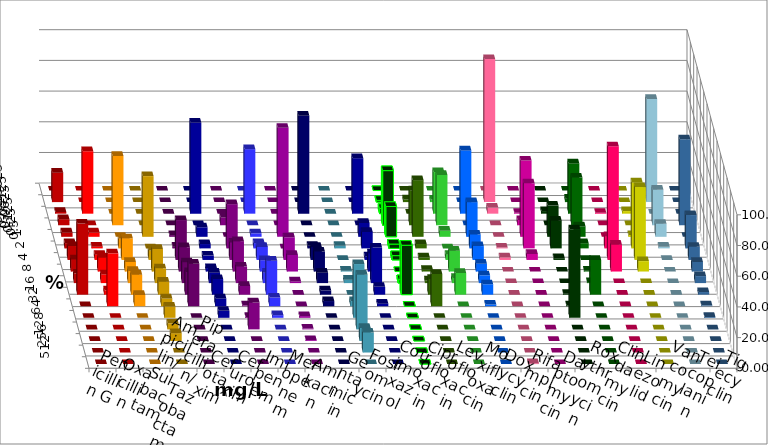
| Category | Penicillin G | Oxacillin | Ampicillin/ Sulbactam | Piperacillin/ Tazobactam | Cefotaxim | Cefuroxim | Imipenem | Meropenem | Amikacin | Gentamicin | Fosfomycin | Cotrimoxazol | Ciprofloxacin | Levofloxacin | Moxifloxacin | Doxycyclin | Rifampicin | Daptomycin | Roxythromycin | Clindamycin | Linezolid | Vancomycin | Teicoplanin | Tigecyclin |
|---|---|---|---|---|---|---|---|---|---|---|---|---|---|---|---|---|---|---|---|---|---|---|---|---|
| 0.015625 | 0 | 0 | 0 | 0 | 0 | 0 | 0 | 0 | 0 | 0 | 0 | 0 | 0 | 0 | 0 | 0 | 0 | 0 | 0 | 0 | 0 | 0 | 0 | 0 |
| 0.03125 | 19.209 | 0 | 0 | 0 | 0 | 0 | 0 | 0 | 0 | 0 | 0 | 0 | 1.13 | 1.705 | 1.695 | 0 | 93.22 | 0 | 0 | 2.26 | 0 | 0 | 0 | 67.232 |
| 0.0625 | 1.13 | 40.678 | 0 | 0 | 0 | 0 | 59.322 | 42.045 | 0 | 63.842 | 0 | 36.158 | 3.39 | 0 | 27.119 | 41.243 | 3.955 | 0.565 | 1.695 | 32.768 | 0.565 | 1.695 | 0 | 0 |
| 0.125 | 3.955 | 0 | 45.198 | 0 | 0 | 5.085 | 0 | 0 | 0 | 0 | 0 | 0 | 35.593 | 22.727 | 32.768 | 0 | 0 | 3.39 | 0 | 31.073 | 0 | 0 | 56 | 23.164 |
| 0.25 | 2.825 | 2.825 | 0 | 39.548 | 1.13 | 0 | 6.215 | 2.273 | 71.023 | 0 | 0 | 9.04 | 19.774 | 36.932 | 3.955 | 22.599 | 0 | 49.718 | 20.339 | 6.78 | 0 | 1.13 | 0 | 8.475 |
| 0.5 | 3.39 | 1.13 | 6.215 | 0 | 1.13 | 28.814 | 2.825 | 3.409 | 0 | 1.695 | 1.695 | 10.734 | 2.825 | 2.841 | 0 | 9.04 | 0.565 | 42.373 | 18.079 | 3.39 | 7.91 | 42.938 | 21.714 | 1.13 |
| 1.0 | 9.04 | 3.39 | 14.124 | 6.215 | 25.989 | 11.299 | 2.825 | 8.523 | 14.773 | 8.475 | 0 | 2.26 | 2.825 | 1.705 | 3.39 | 9.04 | 1.695 | 3.955 | 1.13 | 0 | 74.011 | 47.458 | 8.571 | 0 |
| 2.0 | 7.91 | 9.04 | 6.215 | 14.689 | 15.819 | 19.774 | 2.26 | 7.386 | 10.795 | 12.994 | 0.565 | 11.864 | 0 | 1.136 | 13.559 | 5.085 | 0 | 0 | 0 | 0.565 | 17.514 | 6.78 | 6.286 | 0 |
| 4.0 | 6.215 | 5.65 | 7.91 | 9.605 | 13.559 | 10.734 | 6.78 | 6.818 | 1.136 | 6.78 | 2.26 | 23.164 | 2.26 | 1.705 | 3.39 | 5.085 | 0 | 0 | 0 | 0.565 | 0 | 0 | 4.571 | 0 |
| 8.0 | 46.328 | 2.825 | 12.994 | 8.475 | 14.689 | 5.65 | 10.169 | 22.159 | 0 | 2.825 | 0 | 5.085 | 32.203 | 10.227 | 14.124 | 6.78 | 0 | 0 | 0.565 | 22.599 | 0 | 0 | 1.714 | 0 |
| 16.0 | 0 | 34.463 | 7.345 | 5.085 | 27.684 | 0.565 | 5.085 | 5.682 | 0 | 3.39 | 3.39 | 1.695 | 0 | 21.023 | 0 | 1.13 | 0 | 0 | 0.565 | 0 | 0 | 0 | 0.571 | 0 |
| 32.0 | 0 | 0 | 0 | 7.345 | 0 | 0.565 | 4.52 | 1.705 | 1.136 | 0 | 35.028 | 0 | 0 | 0 | 0 | 0 | 0 | 0 | 57.627 | 0 | 0 | 0 | 0.571 | 0 |
| 64.0 | 0 | 0 | 0 | 3.955 | 0 | 17.514 | 0 | 0 | 0.568 | 0 | 35.593 | 0 | 0 | 0 | 0 | 0 | 0 | 0 | 0 | 0 | 0 | 0 | 0 | 0 |
| 128.0 | 0 | 0 | 0 | 5.085 | 0 | 0 | 0 | 0 | 0.568 | 0 | 8.475 | 0 | 0 | 0 | 0 | 0 | 0 | 0 | 0 | 0 | 0 | 0 | 0 | 0 |
| 256.0 | 0 | 0 | 0 | 0 | 0 | 0 | 0 | 0 | 0 | 0 | 12.994 | 0 | 0 | 0 | 0 | 0 | 0 | 0 | 0 | 0 | 0 | 0 | 0 | 0 |
| 512.0 | 0 | 0 | 0 | 0 | 0 | 0 | 0 | 0 | 0 | 0 | 0 | 0 | 0 | 0 | 0 | 0 | 0.565 | 0 | 0 | 0 | 0 | 0 | 0 | 0 |